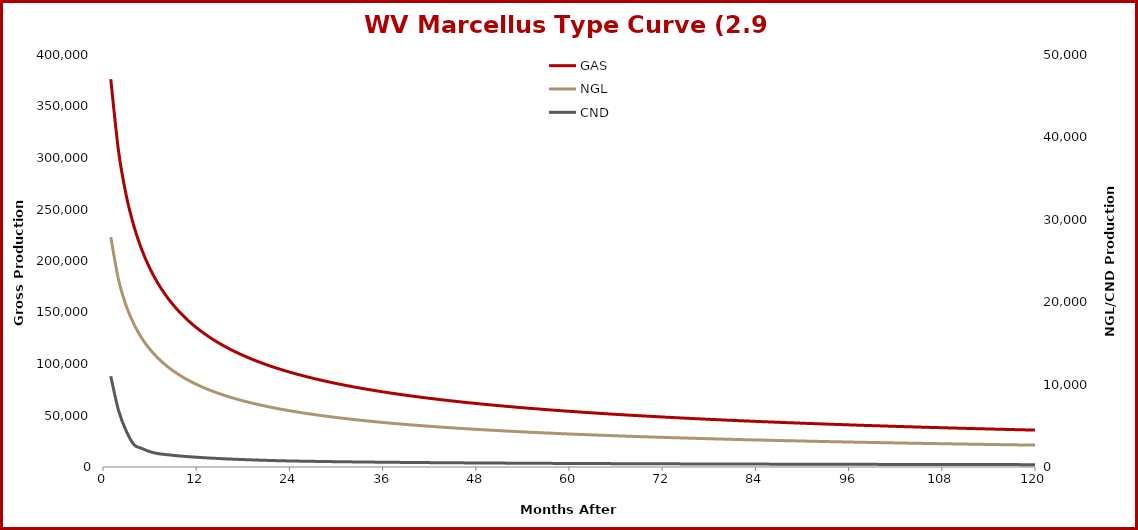
| Category | GAS |
|---|---|
| 1.0 | 376496 |
| 2.0 | 306742 |
| 3.0 | 263384 |
| 4.0 | 233250 |
| 5.0 | 210824 |
| 6.0 | 193340 |
| 7.0 | 179242 |
| 8.0 | 167579 |
| 9.0 | 157733 |
| 10.0 | 149287 |
| 11.0 | 141943 |
| 12.0 | 135484 |
| 13.0 | 129751 |
| 14.0 | 124619 |
| 15.0 | 119992 |
| 16.0 | 115794 |
| 17.0 | 111964 |
| 18.0 | 108453 |
| 19.0 | 105219 |
| 20.0 | 102229 |
| 21.0 | 99454 |
| 22.0 | 96870 |
| 23.0 | 94456 |
| 24.0 | 92196 |
| 25.0 | 90074 |
| 26.0 | 88076 |
| 27.0 | 86192 |
| 28.0 | 84411 |
| 29.0 | 82724 |
| 30.0 | 81123 |
| 31.0 | 79603 |
| 32.0 | 78155 |
| 33.0 | 76775 |
| 34.0 | 75458 |
| 35.0 | 74200 |
| 36.0 | 72995 |
| 37.0 | 71841 |
| 38.0 | 70734 |
| 39.0 | 69671 |
| 40.0 | 68649 |
| 41.0 | 67666 |
| 42.0 | 66720 |
| 43.0 | 65808 |
| 44.0 | 64928 |
| 45.0 | 64078 |
| 46.0 | 63258 |
| 47.0 | 62465 |
| 48.0 | 61697 |
| 49.0 | 60954 |
| 50.0 | 60235 |
| 51.0 | 59537 |
| 52.0 | 58860 |
| 53.0 | 58204 |
| 54.0 | 57566 |
| 55.0 | 56947 |
| 56.0 | 56345 |
| 57.0 | 55760 |
| 58.0 | 55190 |
| 59.0 | 54636 |
| 60.0 | 54096 |
| 61.0 | 53570 |
| 62.0 | 53057 |
| 63.0 | 52557 |
| 64.0 | 52070 |
| 65.0 | 51594 |
| 66.0 | 51130 |
| 67.0 | 50676 |
| 68.0 | 50233 |
| 69.0 | 49800 |
| 70.0 | 49377 |
| 71.0 | 48963 |
| 72.0 | 48559 |
| 73.0 | 48163 |
| 74.0 | 47775 |
| 75.0 | 47396 |
| 76.0 | 47025 |
| 77.0 | 46661 |
| 78.0 | 46304 |
| 79.0 | 45955 |
| 80.0 | 45612 |
| 81.0 | 45277 |
| 82.0 | 44947 |
| 83.0 | 44624 |
| 84.0 | 44307 |
| 85.0 | 43996 |
| 86.0 | 43691 |
| 87.0 | 43391 |
| 88.0 | 43097 |
| 89.0 | 42808 |
| 90.0 | 42524 |
| 91.0 | 42245 |
| 92.0 | 41970 |
| 93.0 | 41701 |
| 94.0 | 41436 |
| 95.0 | 41175 |
| 96.0 | 40918 |
| 97.0 | 40666 |
| 98.0 | 40418 |
| 99.0 | 40174 |
| 100.0 | 39934 |
| 101.0 | 39697 |
| 102.0 | 39464 |
| 103.0 | 39235 |
| 104.0 | 39009 |
| 105.0 | 38787 |
| 106.0 | 38568 |
| 107.0 | 38352 |
| 108.0 | 38140 |
| 109.0 | 37930 |
| 110.0 | 37724 |
| 111.0 | 37520 |
| 112.0 | 37320 |
| 113.0 | 37122 |
| 114.0 | 36927 |
| 115.0 | 36734 |
| 116.0 | 36545 |
| 117.0 | 36357 |
| 118.0 | 36173 |
| 119.0 | 35991 |
| 120.0 | 35811 |
| 121.0 | 35633 |
| 122.0 | 35458 |
| 123.0 | 35285 |
| 124.0 | 35115 |
| 125.0 | 34946 |
| 126.0 | 34780 |
| 127.0 | 34616 |
| 128.0 | 34454 |
| 129.0 | 34293 |
| 130.0 | 34135 |
| 131.0 | 33979 |
| 132.0 | 33824 |
| 133.0 | 33672 |
| 134.0 | 33521 |
| 135.0 | 33372 |
| 136.0 | 33225 |
| 137.0 | 33079 |
| 138.0 | 32935 |
| 139.0 | 32793 |
| 140.0 | 32652 |
| 141.0 | 32513 |
| 142.0 | 32374 |
| 143.0 | 32236 |
| 144.0 | 32099 |
| 145.0 | 31962 |
| 146.0 | 31825 |
| 147.0 | 31690 |
| 148.0 | 31555 |
| 149.0 | 31420 |
| 150.0 | 31286 |
| 151.0 | 31153 |
| 152.0 | 31020 |
| 153.0 | 30887 |
| 154.0 | 30756 |
| 155.0 | 30624 |
| 156.0 | 30494 |
| 157.0 | 30364 |
| 158.0 | 30234 |
| 159.0 | 30105 |
| 160.0 | 29977 |
| 161.0 | 29849 |
| 162.0 | 29722 |
| 163.0 | 29595 |
| 164.0 | 29469 |
| 165.0 | 29343 |
| 166.0 | 29218 |
| 167.0 | 29093 |
| 168.0 | 28969 |
| 169.0 | 28846 |
| 170.0 | 28723 |
| 171.0 | 28600 |
| 172.0 | 28478 |
| 173.0 | 28357 |
| 174.0 | 28236 |
| 175.0 | 28115 |
| 176.0 | 27995 |
| 177.0 | 27876 |
| 178.0 | 27757 |
| 179.0 | 27639 |
| 180.0 | 27521 |
| 181.0 | 27403 |
| 182.0 | 27286 |
| 183.0 | 27170 |
| 184.0 | 27054 |
| 185.0 | 26939 |
| 186.0 | 26824 |
| 187.0 | 26709 |
| 188.0 | 26595 |
| 189.0 | 26482 |
| 190.0 | 26369 |
| 191.0 | 26257 |
| 192.0 | 26145 |
| 193.0 | 26033 |
| 194.0 | 25922 |
| 195.0 | 25811 |
| 196.0 | 25701 |
| 197.0 | 25592 |
| 198.0 | 25483 |
| 199.0 | 25374 |
| 200.0 | 25266 |
| 201.0 | 25158 |
| 202.0 | 25051 |
| 203.0 | 24944 |
| 204.0 | 24837 |
| 205.0 | 24731 |
| 206.0 | 24626 |
| 207.0 | 24521 |
| 208.0 | 24416 |
| 209.0 | 24312 |
| 210.0 | 24208 |
| 211.0 | 24105 |
| 212.0 | 24002 |
| 213.0 | 23900 |
| 214.0 | 23798 |
| 215.0 | 23697 |
| 216.0 | 23596 |
| 217.0 | 23495 |
| 218.0 | 23395 |
| 219.0 | 23295 |
| 220.0 | 23196 |
| 221.0 | 23097 |
| 222.0 | 22998 |
| 223.0 | 22900 |
| 224.0 | 22802 |
| 225.0 | 22705 |
| 226.0 | 22608 |
| 227.0 | 22512 |
| 228.0 | 22416 |
| 229.0 | 22320 |
| 230.0 | 22225 |
| 231.0 | 22130 |
| 232.0 | 22036 |
| 233.0 | 21942 |
| 234.0 | 21848 |
| 235.0 | 21755 |
| 236.0 | 21662 |
| 237.0 | 21570 |
| 238.0 | 21478 |
| 239.0 | 21386 |
| 240.0 | 21295 |
| 241.0 | 21204 |
| 242.0 | 21114 |
| 243.0 | 21024 |
| 244.0 | 20934 |
| 245.0 | 20845 |
| 246.0 | 20756 |
| 247.0 | 20667 |
| 248.0 | 20579 |
| 249.0 | 20491 |
| 250.0 | 20404 |
| 251.0 | 20317 |
| 252.0 | 20230 |
| 253.0 | 20144 |
| 254.0 | 20058 |
| 255.0 | 19972 |
| 256.0 | 19887 |
| 257.0 | 19802 |
| 258.0 | 19718 |
| 259.0 | 19634 |
| 260.0 | 19550 |
| 261.0 | 19467 |
| 262.0 | 19384 |
| 263.0 | 19301 |
| 264.0 | 19219 |
| 265.0 | 19137 |
| 266.0 | 19055 |
| 267.0 | 18974 |
| 268.0 | 18893 |
| 269.0 | 18812 |
| 270.0 | 18732 |
| 271.0 | 18652 |
| 272.0 | 18573 |
| 273.0 | 18493 |
| 274.0 | 18415 |
| 275.0 | 18336 |
| 276.0 | 18258 |
| 277.0 | 18180 |
| 278.0 | 18102 |
| 279.0 | 18025 |
| 280.0 | 17948 |
| 281.0 | 17872 |
| 282.0 | 17795 |
| 283.0 | 17720 |
| 284.0 | 17644 |
| 285.0 | 17569 |
| 286.0 | 17494 |
| 287.0 | 17419 |
| 288.0 | 17345 |
| 289.0 | 17271 |
| 290.0 | 17197 |
| 291.0 | 17124 |
| 292.0 | 17051 |
| 293.0 | 16978 |
| 294.0 | 16906 |
| 295.0 | 16834 |
| 296.0 | 16762 |
| 297.0 | 16690 |
| 298.0 | 16619 |
| 299.0 | 16548 |
| 300.0 | 16478 |
| 301.0 | 16407 |
| 302.0 | 16337 |
| 303.0 | 16268 |
| 304.0 | 16198 |
| 305.0 | 16129 |
| 306.0 | 16060 |
| 307.0 | 15992 |
| 308.0 | 15924 |
| 309.0 | 15856 |
| 310.0 | 15788 |
| 311.0 | 15721 |
| 312.0 | 15654 |
| 313.0 | 15587 |
| 314.0 | 15520 |
| 315.0 | 15454 |
| 316.0 | 15388 |
| 317.0 | 15323 |
| 318.0 | 15257 |
| 319.0 | 15192 |
| 320.0 | 15128 |
| 321.0 | 15063 |
| 322.0 | 14999 |
| 323.0 | 14935 |
| 324.0 | 14871 |
| 325.0 | 14808 |
| 326.0 | 14744 |
| 327.0 | 14682 |
| 328.0 | 14619 |
| 329.0 | 14557 |
| 330.0 | 14495 |
| 331.0 | 14433 |
| 332.0 | 14371 |
| 333.0 | 14310 |
| 334.0 | 14249 |
| 335.0 | 14188 |
| 336.0 | 14128 |
| 337.0 | 14067 |
| 338.0 | 14007 |
| 339.0 | 13948 |
| 340.0 | 13888 |
| 341.0 | 13829 |
| 342.0 | 13770 |
| 343.0 | 13711 |
| 344.0 | 13653 |
| 345.0 | 13594 |
| 346.0 | 13536 |
| 347.0 | 13479 |
| 348.0 | 13421 |
| 349.0 | 13364 |
| 350.0 | 13307 |
| 351.0 | 13250 |
| 352.0 | 13194 |
| 353.0 | 13137 |
| 354.0 | 13081 |
| 355.0 | 13026 |
| 356.0 | 12970 |
| 357.0 | 12915 |
| 358.0 | 12860 |
| 359.0 | 12805 |
| 360.0 | 12750 |
| 361.0 | 12696 |
| 362.0 | 12642 |
| 363.0 | 12588 |
| 364.0 | 12534 |
| 365.0 | 12480 |
| 366.0 | 12427 |
| 367.0 | 12374 |
| 368.0 | 12321 |
| 369.0 | 12269 |
| 370.0 | 12217 |
| 371.0 | 12164 |
| 372.0 | 12113 |
| 373.0 | 12061 |
| 374.0 | 12009 |
| 375.0 | 11958 |
| 376.0 | 11907 |
| 377.0 | 11856 |
| 378.0 | 11806 |
| 379.0 | 11756 |
| 380.0 | 11705 |
| 381.0 | 11655 |
| 382.0 | 11606 |
| 383.0 | 11556 |
| 384.0 | 11507 |
| 385.0 | 11458 |
| 386.0 | 11409 |
| 387.0 | 11360 |
| 388.0 | 11312 |
| 389.0 | 11264 |
| 390.0 | 11216 |
| 391.0 | 11168 |
| 392.0 | 11120 |
| 393.0 | 11073 |
| 394.0 | 11025 |
| 395.0 | 10978 |
| 396.0 | 10932 |
| 397.0 | 10885 |
| 398.0 | 10839 |
| 399.0 | 10792 |
| 400.0 | 10746 |
| 401.0 | 10700 |
| 402.0 | 10655 |
| 403.0 | 10609 |
| 404.0 | 10564 |
| 405.0 | 10519 |
| 406.0 | 10474 |
| 407.0 | 10430 |
| 408.0 | 10385 |
| 409.0 | 10341 |
| 410.0 | 10297 |
| 411.0 | 10253 |
| 412.0 | 10209 |
| 413.0 | 10165 |
| 414.0 | 10122 |
| 415.0 | 10079 |
| 416.0 | 10036 |
| 417.0 | 9993 |
| 418.0 | 9950 |
| 419.0 | 9908 |
| 420.0 | 9866 |
| 421.0 | 9824 |
| 422.0 | 9782 |
| 423.0 | 9740 |
| 424.0 | 9699 |
| 425.0 | 9657 |
| 426.0 | 9616 |
| 427.0 | 9575 |
| 428.0 | 9534 |
| 429.0 | 9493 |
| 430.0 | 9453 |
| 431.0 | 9413 |
| 432.0 | 9372 |
| 433.0 | 9333 |
| 434.0 | 9293 |
| 435.0 | 9253 |
| 436.0 | 9214 |
| 437.0 | 9174 |
| 438.0 | 9135 |
| 439.0 | 9096 |
| 440.0 | 9057 |
| 441.0 | 9019 |
| 442.0 | 8980 |
| 443.0 | 8942 |
| 444.0 | 8904 |
| 445.0 | 8866 |
| 446.0 | 8828 |
| 447.0 | 8790 |
| 448.0 | 8753 |
| 449.0 | 8716 |
| 450.0 | 8678 |
| 451.0 | 8641 |
| 452.0 | 8605 |
| 453.0 | 8568 |
| 454.0 | 8531 |
| 455.0 | 8495 |
| 456.0 | 8459 |
| 457.0 | 8423 |
| 458.0 | 8387 |
| 459.0 | 8351 |
| 460.0 | 8315 |
| 461.0 | 8280 |
| 462.0 | 8244 |
| 463.0 | 8209 |
| 464.0 | 8174 |
| 465.0 | 8139 |
| 466.0 | 8105 |
| 467.0 | 8070 |
| 468.0 | 8036 |
| 469.0 | 8001 |
| 470.0 | 7967 |
| 471.0 | 7933 |
| 472.0 | 7900 |
| 473.0 | 7866 |
| 474.0 | 7832 |
| 475.0 | 7799 |
| 476.0 | 7766 |
| 477.0 | 7732 |
| 478.0 | 7699 |
| 479.0 | 7667 |
| 480.0 | 7634 |
| 481.0 | 7601 |
| 482.0 | 7569 |
| 483.0 | 7537 |
| 484.0 | 7505 |
| 485.0 | 7473 |
| 486.0 | 7441 |
| 487.0 | 7409 |
| 488.0 | 7377 |
| 489.0 | 7346 |
| 490.0 | 7315 |
| 491.0 | 7283 |
| 492.0 | 7252 |
| 493.0 | 7221 |
| 494.0 | 7191 |
| 495.0 | 7160 |
| 496.0 | 7129 |
| 497.0 | 7099 |
| 498.0 | 7069 |
| 499.0 | 7038 |
| 500.0 | 7008 |
| 501.0 | 6979 |
| 502.0 | 6949 |
| 503.0 | 6919 |
| 504.0 | 6890 |
| 505.0 | 6860 |
| 506.0 | 6831 |
| 507.0 | 6802 |
| 508.0 | 6773 |
| 509.0 | 6744 |
| 510.0 | 6715 |
| 511.0 | 6687 |
| 512.0 | 6658 |
| 513.0 | 6630 |
| 514.0 | 6601 |
| 515.0 | 6573 |
| 516.0 | 6545 |
| 517.0 | 6517 |
| 518.0 | 6489 |
| 519.0 | 6462 |
| 520.0 | 6434 |
| 521.0 | 6407 |
| 522.0 | 6379 |
| 523.0 | 6352 |
| 524.0 | 6325 |
| 525.0 | 6298 |
| 526.0 | 6271 |
| 527.0 | 6245 |
| 528.0 | 6218 |
| 529.0 | 6191 |
| 530.0 | 6165 |
| 531.0 | 6139 |
| 532.0 | 6112 |
| 533.0 | 6086 |
| 534.0 | 6060 |
| 535.0 | 6035 |
| 536.0 | 6009 |
| 537.0 | 5983 |
| 538.0 | 5958 |
| 539.0 | 5932 |
| 540.0 | 5907 |
| 541.0 | 5882 |
| 542.0 | 5857 |
| 543.0 | 5832 |
| 544.0 | 5807 |
| 545.0 | 5782 |
| 546.0 | 5757 |
| 547.0 | 5733 |
| 548.0 | 5708 |
| 549.0 | 5684 |
| 550.0 | 5660 |
| 551.0 | 5636 |
| 552.0 | 5612 |
| 553.0 | 5588 |
| 554.0 | 5564 |
| 555.0 | 5540 |
| 556.0 | 5517 |
| 557.0 | 5493 |
| 558.0 | 5470 |
| 559.0 | 5446 |
| 560.0 | 5423 |
| 561.0 | 5400 |
| 562.0 | 5377 |
| 563.0 | 5354 |
| 564.0 | 5331 |
| 565.0 | 5308 |
| 566.0 | 5286 |
| 567.0 | 5263 |
| 568.0 | 5241 |
| 569.0 | 5218 |
| 570.0 | 5196 |
| 571.0 | 5174 |
| 572.0 | 5152 |
| 573.0 | 5130 |
| 574.0 | 5108 |
| 575.0 | 5086 |
| 576.0 | 5065 |
| 577.0 | 5043 |
| 578.0 | 5021 |
| 579.0 | 5000 |
| 580.0 | 4979 |
| 581.0 | 4957 |
| 582.0 | 4936 |
| 583.0 | 4915 |
| 584.0 | 4894 |
| 585.0 | 4873 |
| 586.0 | 4853 |
| 587.0 | 4832 |
| 588.0 | 4811 |
| 589.0 | 4791 |
| 590.0 | 4770 |
| 591.0 | 4750 |
| 592.0 | 4730 |
| 593.0 | 4710 |
| 594.0 | 4689 |
| 595.0 | 4669 |
| 596.0 | 4650 |
| 597.0 | 4630 |
| 598.0 | 4610 |
| 599.0 | 4590 |
| 600.0 | 4571 |
| 601.0 | 4551 |
| 602.0 | 4532 |
| 603.0 | 4512 |
| 604.0 | 4493 |
| 605.0 | 4474 |
| 606.0 | 4455 |
| 607.0 | 4436 |
| 608.0 | 4417 |
| 609.0 | 4398 |
| 610.0 | 4379 |
| 611.0 | 4361 |
| 612.0 | 4342 |
| 613.0 | 4324 |
| 614.0 | 4305 |
| 615.0 | 4287 |
| 616.0 | 4269 |
| 617.0 | 4250 |
| 618.0 | 4232 |
| 619.0 | 4214 |
| 620.0 | 4196 |
| 621.0 | 4178 |
| 622.0 | 4160 |
| 623.0 | 4143 |
| 624.0 | 4125 |
| 625.0 | 4107 |
| 626.0 | 4090 |
| 627.0 | 4073 |
| 628.0 | 4055 |
| 629.0 | 4038 |
| 630.0 | 4021 |
| 631.0 | 4003 |
| 632.0 | 3986 |
| 633.0 | 3969 |
| 634.0 | 3952 |
| 635.0 | 3936 |
| 636.0 | 3919 |
| 637.0 | 3902 |
| 638.0 | 3885 |
| 639.0 | 3869 |
| 640.0 | 3852 |
| 641.0 | 3836 |
| 642.0 | 3820 |
| 643.0 | 3803 |
| 644.0 | 3787 |
| 645.0 | 3771 |
| 646.0 | 3755 |
| 647.0 | 3739 |
| 648.0 | 3723 |
| 649.0 | 3707 |
| 650.0 | 3691 |
| 651.0 | 3675 |
| 652.0 | 3660 |
| 653.0 | 3644 |
| 654.0 | 3629 |
| 655.0 | 3613 |
| 656.0 | 3598 |
| 657.0 | 3582 |
| 658.0 | 3567 |
| 659.0 | 3552 |
| 660.0 | 3537 |
| 661.0 | 3522 |
| 662.0 | 3507 |
| 663.0 | 3492 |
| 664.0 | 3477 |
| 665.0 | 3462 |
| 666.0 | 3447 |
| 667.0 | 3432 |
| 668.0 | 3418 |
| 669.0 | 3403 |
| 670.0 | 3389 |
| 671.0 | 3374 |
| 672.0 | 3360 |
| 673.0 | 3346 |
| 674.0 | 3331 |
| 675.0 | 3317 |
| 676.0 | 3303 |
| 677.0 | 3289 |
| 678.0 | 3275 |
| 679.0 | 3261 |
| 680.0 | 3247 |
| 681.0 | 3233 |
| 682.0 | 3219 |
| 683.0 | 3206 |
| 684.0 | 3192 |
| 685.0 | 3178 |
| 686.0 | 3165 |
| 687.0 | 3151 |
| 688.0 | 3138 |
| 689.0 | 3124 |
| 690.0 | 3111 |
| 691.0 | 3098 |
| 692.0 | 3085 |
| 693.0 | 3071 |
| 694.0 | 3058 |
| 695.0 | 3045 |
| 696.0 | 3032 |
| 697.0 | 3019 |
| 698.0 | 3007 |
| 699.0 | 2994 |
| 700.0 | 2981 |
| 701.0 | 2968 |
| 702.0 | 2956 |
| 703.0 | 2943 |
| 704.0 | 2930 |
| 705.0 | 2918 |
| 706.0 | 2905 |
| 707.0 | 2893 |
| 708.0 | 2881 |
| 709.0 | 2868 |
| 710.0 | 2856 |
| 711.0 | 2844 |
| 712.0 | 2832 |
| 713.0 | 2820 |
| 714.0 | 2808 |
| 715.0 | 2796 |
| 716.0 | 2784 |
| 717.0 | 2772 |
| 718.0 | 2760 |
| 719.0 | 2748 |
| 720.0 | 2737 |
| 721.0 | 2725 |
| 722.0 | 2713 |
| 723.0 | 2702 |
| 724.0 | 2690 |
| 725.0 | 2679 |
| 726.0 | 2667 |
| 727.0 | 2656 |
| 728.0 | 2645 |
| 729.0 | 2633 |
| 730.0 | 2622 |
| 731.0 | 2611 |
| 732.0 | 2600 |
| 733.0 | 2589 |
| 734.0 | 2578 |
| 735.0 | 2567 |
| 736.0 | 2556 |
| 737.0 | 2545 |
| 738.0 | 2534 |
| 739.0 | 2523 |
| 740.0 | 2512 |
| 741.0 | 2502 |
| 742.0 | 2491 |
| 743.0 | 2480 |
| 744.0 | 2470 |
| 745.0 | 2459 |
| 746.0 | 2449 |
| 747.0 | 2438 |
| 748.0 | 2428 |
| 749.0 | 2418 |
| 750.0 | 2407 |
| 751.0 | 2397 |
| 752.0 | 2387 |
| 753.0 | 2377 |
| 754.0 | 2366 |
| 755.0 | 2356 |
| 756.0 | 2346 |
| 757.0 | 2336 |
| 758.0 | 2326 |
| 759.0 | 2316 |
| 760.0 | 2307 |
| 761.0 | 2297 |
| 762.0 | 2287 |
| 763.0 | 2277 |
| 764.0 | 2267 |
| 765.0 | 2258 |
| 766.0 | 2248 |
| 767.0 | 2239 |
| 768.0 | 2229 |
| 769.0 | 2220 |
| 770.0 | 2210 |
| 771.0 | 2201 |
| 772.0 | 2191 |
| 773.0 | 2182 |
| 774.0 | 2173 |
| 775.0 | 2163 |
| 776.0 | 2154 |
| 777.0 | 2145 |
| 778.0 | 2136 |
| 779.0 | 2127 |
| 780.0 | 2118 |